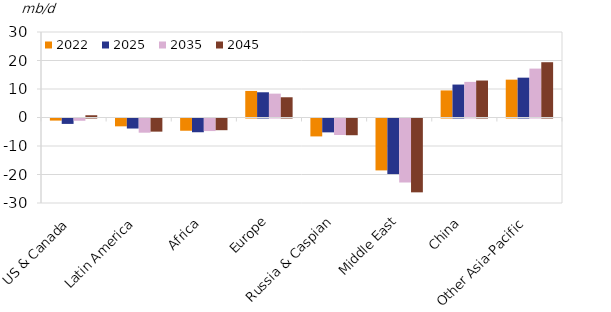
| Category | 2022 | 2025 | 2035 | 2045 |
|---|---|---|---|---|
| US & Canada | -0.735 | -1.899 | -0.797 | 0.789 |
| Latin America | -2.75 | -3.519 | -4.979 | -4.609 |
| Africa | -4.294 | -4.821 | -4.407 | -4.102 |
| Europe | 9.316 | 8.852 | 8.374 | 7.101 |
| Russia & Caspian | -6.286 | -4.861 | -5.798 | -5.869 |
| Middle East | -18.213 | -19.504 | -22.421 | -25.908 |
| China | 9.495 | 11.559 | 12.501 | 12.972 |
| Other Asia-Pacific | 13.281 | 13.978 | 17.158 | 19.398 |